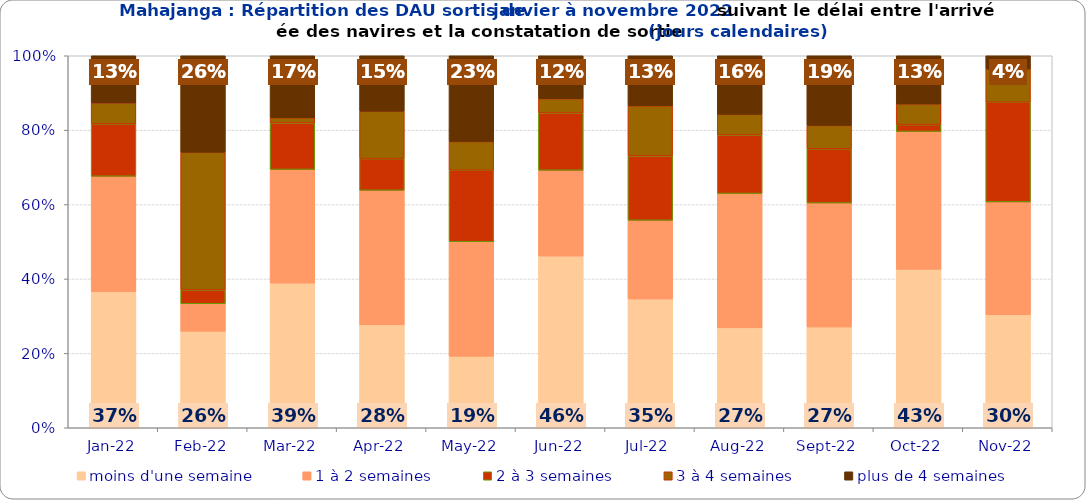
| Category | moins d'une semaine | 1 à 2 semaines | 2 à 3 semaines | 3 à 4 semaines | plus de 4 semaines |
|---|---|---|---|---|---|
| 2022-01-01 | 0.366 | 0.31 | 0.141 | 0.056 | 0.127 |
| 2022-02-01 | 0.259 | 0.074 | 0.037 | 0.37 | 0.259 |
| 2022-03-01 | 0.389 | 0.306 | 0.125 | 0.014 | 0.167 |
| 2022-04-01 | 0.277 | 0.362 | 0.085 | 0.128 | 0.149 |
| 2022-05-01 | 0.192 | 0.308 | 0.192 | 0.077 | 0.231 |
| 2022-06-01 | 0.462 | 0.231 | 0.154 | 0.038 | 0.115 |
| 2022-07-01 | 0.346 | 0.212 | 0.173 | 0.135 | 0.135 |
| 2022-08-01 | 0.269 | 0.361 | 0.157 | 0.056 | 0.157 |
| 2022-09-01 | 0.271 | 0.333 | 0.146 | 0.062 | 0.188 |
| 2022-10-01 | 0.426 | 0.37 | 0.019 | 0.056 | 0.13 |
| 2022-11-01 | 0.304 | 0.304 | 0.268 | 0.089 | 0.036 |